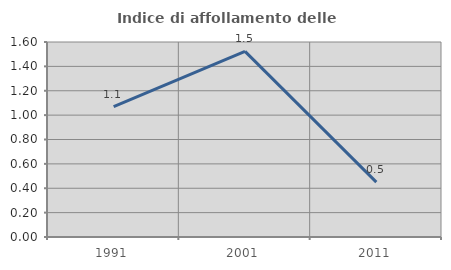
| Category | Indice di affollamento delle abitazioni  |
|---|---|
| 1991.0 | 1.07 |
| 2001.0 | 1.523 |
| 2011.0 | 0.45 |